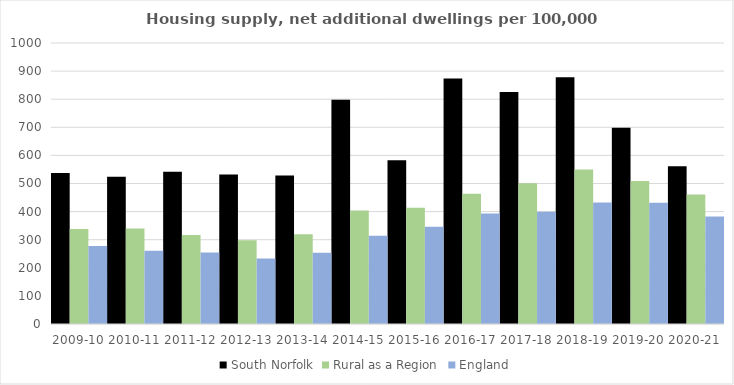
| Category | South Norfolk | Rural as a Region | England |
|---|---|---|---|
| 2009-10 | 536.983 | 337.852 | 277.548 |
| 2010-11 | 524.423 | 340.105 | 260.994 |
| 2011-12 | 542.19 | 317.04 | 254.007 |
| 2012-13 | 531.801 | 297.763 | 233.153 |
| 2013-14 | 528.657 | 319.835 | 253.602 |
| 2014-15 | 797.866 | 403.796 | 314.256 |
| 2015-16 | 583.084 | 414.091 | 346.154 |
| 2016-17 | 873.914 | 463.209 | 393.256 |
| 2017-18 | 825.269 | 500.68 | 399.646 |
| 2018-19 | 878.153 | 549.491 | 432.099 |
| 2019-20 | 698.467 | 508.493 | 431.187 |
| 2020-21 | 561.279 | 461.114 | 382.827 |